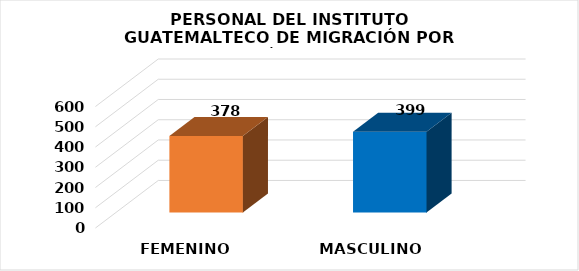
| Category | Series 0 |
|---|---|
| FEMENINO | 378 |
| MASCULINO | 399 |